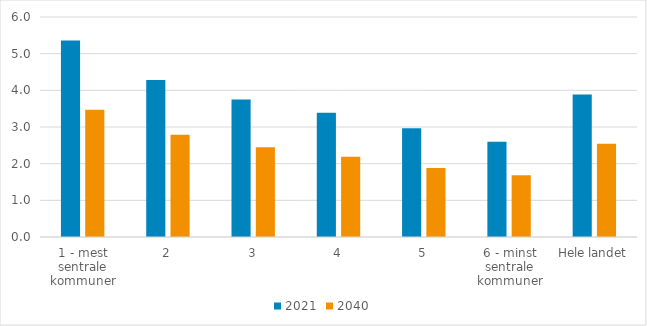
| Category | 2021 | 2040 |
|---|---|---|
| 1 - mest sentrale kommuner | 5.356 | 3.468 |
| 2 | 4.279 | 2.789 |
| 3 | 3.75 | 2.448 |
| 4 | 3.389 | 2.188 |
| 5 | 2.965 | 1.883 |
| 6 - minst sentrale kommuner | 2.598 | 1.685 |
| Hele landet | 3.889 | 2.546 |